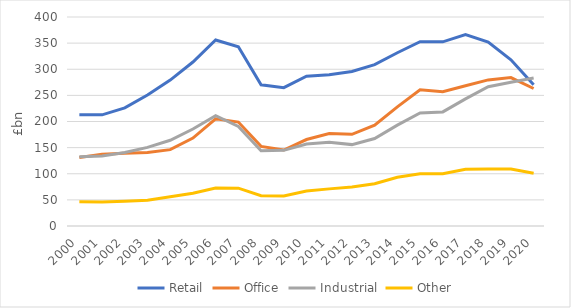
| Category | Retail | Office | Industrial | Other |
|---|---|---|---|---|
| 2000.0 | 212.759 | 131.088 | 132.402 | 46.289 |
| 2001.0 | 212.682 | 137.336 | 133.86 | 45.927 |
| 2002.0 | 225.983 | 139.25 | 140.812 | 47.53 |
| 2003.0 | 250.617 | 140.664 | 150.465 | 49.491 |
| 2004.0 | 279.259 | 146.103 | 164.098 | 55.803 |
| 2005.0 | 313.844 | 168.276 | 185.698 | 62.848 |
| 2006.0 | 355.92 | 205.004 | 211.065 | 72.542 |
| 2007.0 | 343.04 | 198.859 | 190.435 | 72.365 |
| 2008.0 | 270.328 | 152.349 | 143.991 | 57.863 |
| 2009.0 | 264.734 | 145.387 | 144.752 | 57.632 |
| 2010.0 | 286.654 | 165.474 | 156.827 | 66.975 |
| 2011.0 | 289.315 | 176.866 | 160.431 | 71.047 |
| 2012.0 | 295.775 | 175.41 | 155.77 | 74.614 |
| 2013.0 | 308.819 | 192.969 | 167.44 | 80.737 |
| 2014.0 | 331.63 | 227.983 | 192.992 | 93.328 |
| 2015.0 | 352.673 | 260.768 | 216.198 | 100.082 |
| 2016.0 | 352.502 | 256.972 | 218.347 | 100.205 |
| 2017.0 | 366.25 | 268.508 | 243.256 | 108.628 |
| 2018.0 | 352.101 | 279.6 | 266.434 | 109.272 |
| 2019.0 | 318.004 | 284.092 | 275.15 | 108.992 |
| 2020.0 | 270.525 | 263.175 | 283.337 | 100.817 |